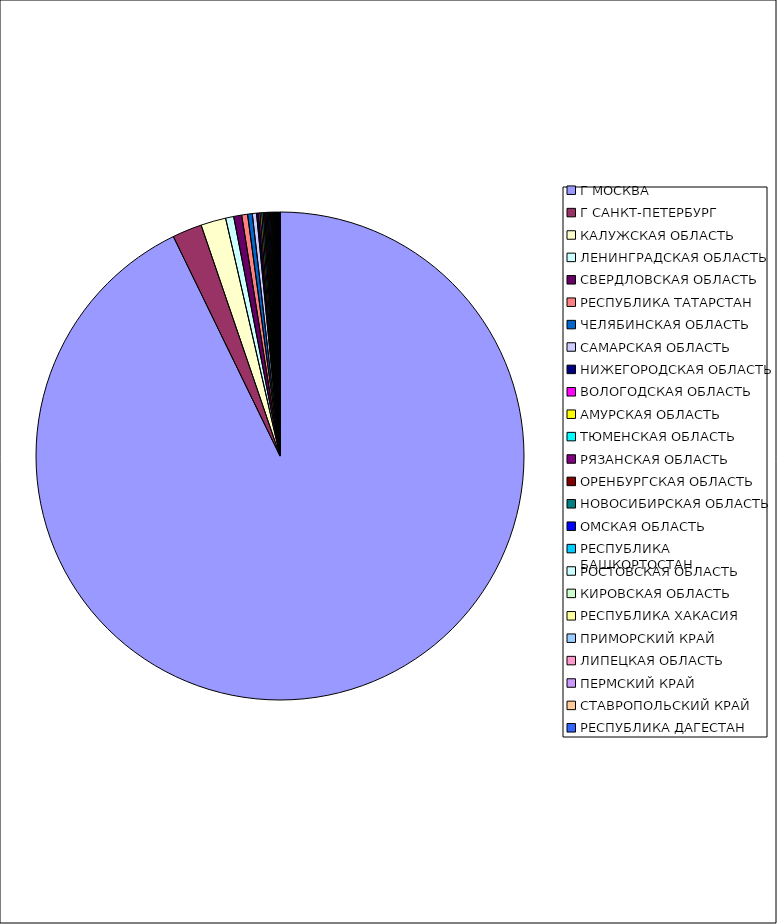
| Category | Оборот |
|---|---|
| Г МОСКВА | 0.928 |
| Г САНКТ-ПЕТЕРБУРГ | 0.02 |
| КАЛУЖСКАЯ ОБЛАСТЬ | 0.017 |
| ЛЕНИНГРАДСКАЯ ОБЛАСТЬ | 0.005 |
| СВЕРДЛОВСКАЯ ОБЛАСТЬ | 0.005 |
| РЕСПУБЛИКА ТАТАРСТАН | 0.004 |
| ЧЕЛЯБИНСКАЯ ОБЛАСТЬ | 0.003 |
| САМАРСКАЯ ОБЛАСТЬ | 0.003 |
| НИЖЕГОРОДСКАЯ ОБЛАСТЬ | 0.001 |
| ВОЛОГОДСКАЯ ОБЛАСТЬ | 0.001 |
| АМУРСКАЯ ОБЛАСТЬ | 0.001 |
| ТЮМЕНСКАЯ ОБЛАСТЬ | 0.001 |
| РЯЗАНСКАЯ ОБЛАСТЬ | 0.001 |
| ОРЕНБУРГСКАЯ ОБЛАСТЬ | 0.001 |
| НОВОСИБИРСКАЯ ОБЛАСТЬ | 0.001 |
| ОМСКАЯ ОБЛАСТЬ | 0.001 |
| РЕСПУБЛИКА БАШКОРТОСТАН | 0.001 |
| РОСТОВСКАЯ ОБЛАСТЬ | 0.001 |
| КИРОВСКАЯ ОБЛАСТЬ | 0.001 |
| РЕСПУБЛИКА ХАКАСИЯ | 0.001 |
| ПРИМОРСКИЙ КРАЙ | 0 |
| ЛИПЕЦКАЯ ОБЛАСТЬ | 0 |
| ПЕРМСКИЙ КРАЙ | 0 |
| СТАВРОПОЛЬСКИЙ КРАЙ | 0 |
| РЕСПУБЛИКА ДАГЕСТАН | 0 |
| САРАТОВСКАЯ ОБЛАСТЬ | 0 |
| КРАСНОДАРСКИЙ КРАЙ | 0 |
| КАБАРДИНО-БАЛКАРСКАЯ РЕСПУБЛИКА | 0 |
| КАЛИНИНГРАДСКАЯ ОБЛАСТЬ | 0 |
| УДМУРТСКАЯ РЕСПУБЛИКА | 0 |
| ПСКОВСКАЯ ОБЛАСТЬ | 0 |
| ИВАНОВСКАЯ ОБЛАСТЬ | 0 |
| РЕСПУБЛИКА МОРДОВИЯ | 0 |
| ИРКУТСКАЯ ОБЛАСТЬ | 0 |
| УЛЬЯНОВСКАЯ ОБЛАСТЬ | 0 |
| КУРСКАЯ ОБЛАСТЬ | 0 |
| ТУЛЬСКАЯ ОБЛАСТЬ | 0 |
| РЕСПУБЛИКА КОМИ | 0 |
| САХАЛИНСКАЯ ОБЛАСТЬ | 0 |
| РЕСПУБЛИКА СЕВЕРНАЯ ОСЕТИЯ-АЛАНИЯ | 0 |
| АЛТАЙСКИЙ КРАЙ | 0 |
| ЧУВАШСКАЯ РЕСПУБЛИКА | 0 |
| СМОЛЕНСКАЯ ОБЛАСТЬ | 0 |
| БЕЛГОРОДСКАЯ ОБЛАСТЬ | 0 |
| КРАСНОЯРСКИЙ КРАЙ | 0 |